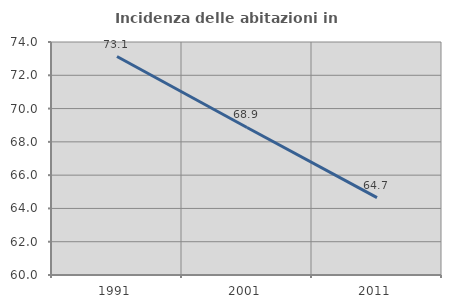
| Category | Incidenza delle abitazioni in proprietà  |
|---|---|
| 1991.0 | 73.127 |
| 2001.0 | 68.864 |
| 2011.0 | 64.651 |